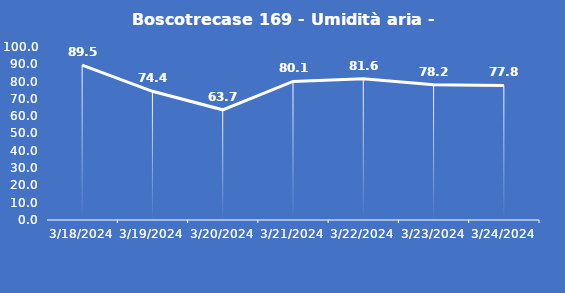
| Category | Boscotrecase 169 - Umidità aria - Grezzo (%) |
|---|---|
| 3/18/24 | 89.5 |
| 3/19/24 | 74.4 |
| 3/20/24 | 63.7 |
| 3/21/24 | 80.1 |
| 3/22/24 | 81.6 |
| 3/23/24 | 78.2 |
| 3/24/24 | 77.8 |